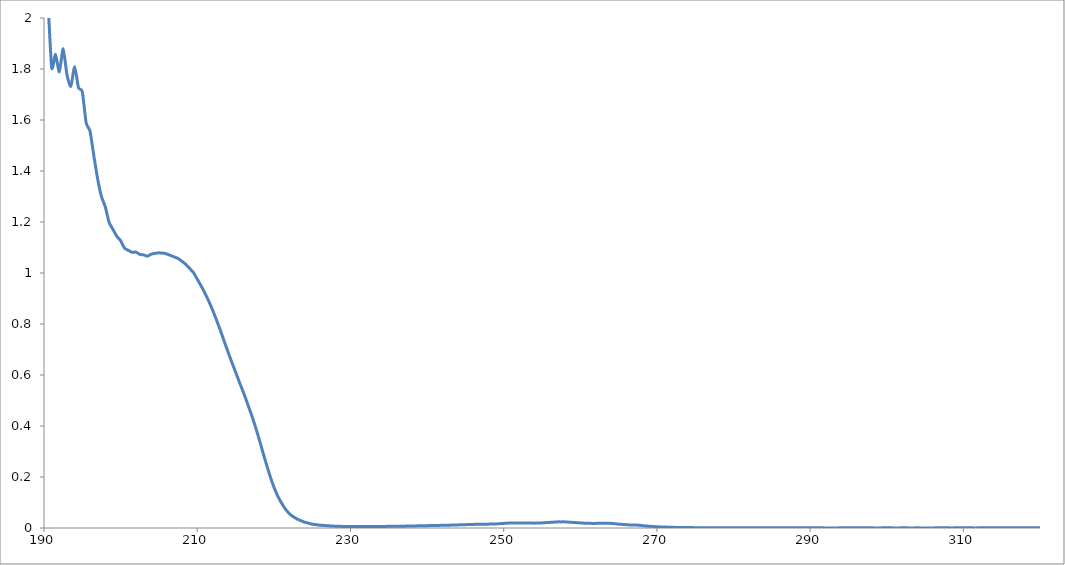
| Category | Series 0 |
|---|---|
| 190.0 | 2.174 |
| 190.5 | 2.067 |
| 191.0 | 1.805 |
| 191.5 | 1.857 |
| 192.0 | 1.789 |
| 192.5 | 1.879 |
| 193.0 | 1.777 |
| 193.5 | 1.732 |
| 194.0 | 1.809 |
| 194.5 | 1.727 |
| 195.0 | 1.711 |
| 195.5 | 1.589 |
| 196.0 | 1.557 |
| 196.5 | 1.461 |
| 197.0 | 1.369 |
| 197.5 | 1.3 |
| 198.0 | 1.259 |
| 198.5 | 1.198 |
| 199.0 | 1.171 |
| 199.5 | 1.144 |
| 200.0 | 1.127 |
| 200.5 | 1.098 |
| 201.0 | 1.089 |
| 201.5 | 1.081 |
| 202.0 | 1.082 |
| 202.5 | 1.073 |
| 203.0 | 1.071 |
| 203.5 | 1.066 |
| 204.0 | 1.074 |
| 204.5 | 1.077 |
| 205.0 | 1.079 |
| 205.5 | 1.078 |
| 206.0 | 1.075 |
| 206.5 | 1.069 |
| 207.0 | 1.063 |
| 207.5 | 1.057 |
| 208.0 | 1.046 |
| 208.5 | 1.034 |
| 209.0 | 1.018 |
| 209.5 | 1.002 |
| 210.0 | 0.976 |
| 210.5 | 0.95 |
| 211.0 | 0.921 |
| 211.5 | 0.89 |
| 212.0 | 0.855 |
| 212.5 | 0.817 |
| 213.0 | 0.777 |
| 213.5 | 0.734 |
| 214.0 | 0.692 |
| 214.5 | 0.651 |
| 215.0 | 0.612 |
| 215.5 | 0.572 |
| 216.0 | 0.534 |
| 216.5 | 0.493 |
| 217.0 | 0.451 |
| 217.5 | 0.406 |
| 218.0 | 0.357 |
| 218.5 | 0.304 |
| 219.0 | 0.253 |
| 219.5 | 0.204 |
| 220.0 | 0.161 |
| 220.5 | 0.126 |
| 221.0 | 0.098 |
| 221.5 | 0.075 |
| 222.0 | 0.057 |
| 222.5 | 0.045 |
| 223.0 | 0.036 |
| 223.5 | 0.029 |
| 224.0 | 0.023 |
| 224.5 | 0.019 |
| 225.0 | 0.015 |
| 225.5 | 0.013 |
| 226.0 | 0.011 |
| 226.5 | 0.01 |
| 227.0 | 0.009 |
| 227.5 | 0.008 |
| 228.0 | 0.007 |
| 228.5 | 0.007 |
| 229.0 | 0.006 |
| 229.5 | 0.006 |
| 230.0 | 0.006 |
| 230.5 | 0.006 |
| 231.0 | 0.006 |
| 231.5 | 0.006 |
| 232.0 | 0.006 |
| 232.5 | 0.006 |
| 233.0 | 0.006 |
| 233.5 | 0.006 |
| 234.0 | 0.006 |
| 234.5 | 0.006 |
| 235.0 | 0.007 |
| 235.5 | 0.007 |
| 236.0 | 0.007 |
| 236.5 | 0.007 |
| 237.0 | 0.007 |
| 237.5 | 0.008 |
| 238.0 | 0.008 |
| 238.5 | 0.008 |
| 239.0 | 0.009 |
| 239.5 | 0.009 |
| 240.0 | 0.009 |
| 240.5 | 0.01 |
| 241.0 | 0.01 |
| 241.5 | 0.01 |
| 242.0 | 0.011 |
| 242.5 | 0.011 |
| 243.0 | 0.011 |
| 243.5 | 0.012 |
| 244.0 | 0.012 |
| 244.5 | 0.013 |
| 245.0 | 0.013 |
| 245.5 | 0.014 |
| 246.0 | 0.014 |
| 246.5 | 0.015 |
| 247.0 | 0.015 |
| 247.5 | 0.015 |
| 248.0 | 0.015 |
| 248.5 | 0.016 |
| 249.0 | 0.016 |
| 249.5 | 0.017 |
| 250.0 | 0.018 |
| 250.5 | 0.019 |
| 251.0 | 0.02 |
| 251.5 | 0.02 |
| 252.0 | 0.02 |
| 252.5 | 0.02 |
| 253.0 | 0.02 |
| 253.5 | 0.02 |
| 254.0 | 0.019 |
| 254.5 | 0.02 |
| 255.0 | 0.02 |
| 255.5 | 0.021 |
| 256.0 | 0.022 |
| 256.5 | 0.023 |
| 257.0 | 0.024 |
| 257.5 | 0.024 |
| 258.0 | 0.024 |
| 258.5 | 0.023 |
| 259.0 | 0.022 |
| 259.5 | 0.021 |
| 260.0 | 0.02 |
| 260.5 | 0.019 |
| 261.0 | 0.019 |
| 261.5 | 0.018 |
| 262.0 | 0.018 |
| 262.5 | 0.019 |
| 263.0 | 0.019 |
| 263.5 | 0.019 |
| 264.0 | 0.018 |
| 264.5 | 0.017 |
| 265.0 | 0.015 |
| 265.5 | 0.014 |
| 266.0 | 0.013 |
| 266.5 | 0.012 |
| 267.0 | 0.012 |
| 267.5 | 0.011 |
| 268.0 | 0.01 |
| 268.5 | 0.008 |
| 269.0 | 0.007 |
| 269.5 | 0.006 |
| 270.0 | 0.005 |
| 270.5 | 0.004 |
| 271.0 | 0.004 |
| 271.5 | 0.003 |
| 272.0 | 0.003 |
| 272.5 | 0.002 |
| 273.0 | 0.002 |
| 273.5 | 0.002 |
| 274.0 | 0.002 |
| 274.5 | 0.002 |
| 275.0 | 0.001 |
| 275.5 | 0.001 |
| 276.0 | 0.001 |
| 276.5 | 0.001 |
| 277.0 | 0.001 |
| 277.5 | 0.001 |
| 278.0 | 0.001 |
| 278.5 | 0.001 |
| 279.0 | 0.001 |
| 279.5 | 0.001 |
| 280.0 | 0.001 |
| 280.5 | 0.001 |
| 281.0 | 0.001 |
| 281.5 | 0.001 |
| 282.0 | 0.001 |
| 282.5 | 0.001 |
| 283.0 | 0.001 |
| 283.5 | 0.001 |
| 284.0 | 0.001 |
| 284.5 | 0.001 |
| 285.0 | 0.001 |
| 285.5 | 0.001 |
| 286.0 | 0.001 |
| 286.5 | 0.001 |
| 287.0 | 0.001 |
| 287.5 | 0.001 |
| 288.0 | 0.001 |
| 288.5 | 0.001 |
| 289.0 | 0.001 |
| 289.5 | 0.001 |
| 290.0 | 0.001 |
| 290.5 | 0.001 |
| 291.0 | 0.001 |
| 291.5 | 0.001 |
| 292.0 | 0 |
| 292.5 | 0 |
| 293.0 | 0 |
| 293.5 | 0 |
| 294.0 | 0.001 |
| 294.5 | 0.001 |
| 295.0 | 0.001 |
| 295.5 | 0.001 |
| 296.0 | 0.001 |
| 296.5 | 0.001 |
| 297.0 | 0.001 |
| 297.5 | 0.001 |
| 298.0 | 0.001 |
| 298.5 | 0 |
| 299.0 | 0 |
| 299.5 | 0.001 |
| 300.0 | 0.001 |
| 300.5 | 0.001 |
| 301.0 | 0 |
| 301.5 | 0 |
| 302.0 | 0.001 |
| 302.5 | 0.001 |
| 303.0 | 0 |
| 303.5 | 0 |
| 304.0 | 0.001 |
| 304.5 | 0 |
| 305.0 | 0 |
| 305.5 | 0 |
| 306.0 | 0 |
| 306.5 | 0.001 |
| 307.0 | 0.001 |
| 307.5 | 0.001 |
| 308.0 | 0.001 |
| 308.5 | 0 |
| 309.0 | 0.001 |
| 309.5 | 0.001 |
| 310.0 | 0.001 |
| 310.5 | 0.001 |
| 311.0 | 0.001 |
| 311.5 | 0 |
| 312.0 | 0.001 |
| 312.5 | 0.001 |
| 313.0 | 0.001 |
| 313.5 | 0.001 |
| 314.0 | 0.001 |
| 314.5 | 0.001 |
| 315.0 | 0.001 |
| 315.5 | 0.001 |
| 316.0 | 0.001 |
| 316.5 | 0.001 |
| 317.0 | 0.001 |
| 317.5 | 0.001 |
| 318.0 | 0.001 |
| 318.5 | 0.001 |
| 319.0 | 0.001 |
| 319.5 | 0.001 |
| 320.0 | 0.001 |